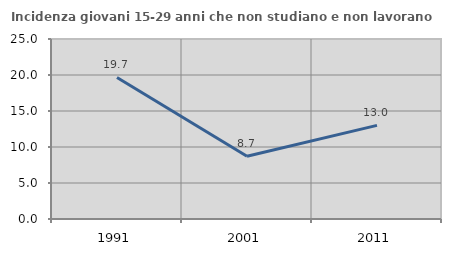
| Category | Incidenza giovani 15-29 anni che non studiano e non lavorano  |
|---|---|
| 1991.0 | 19.656 |
| 2001.0 | 8.711 |
| 2011.0 | 13.006 |